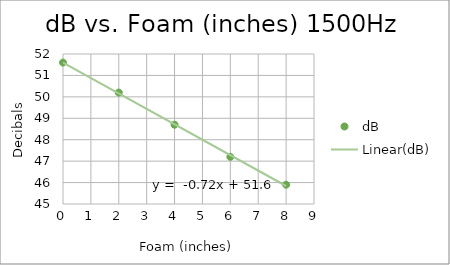
| Category | dB |
|---|---|
| 0.0 | 51.6 |
| 2.0 | 50.2 |
| 4.0 | 48.7 |
| 6.0 | 47.2 |
| 8.0 | 45.9 |